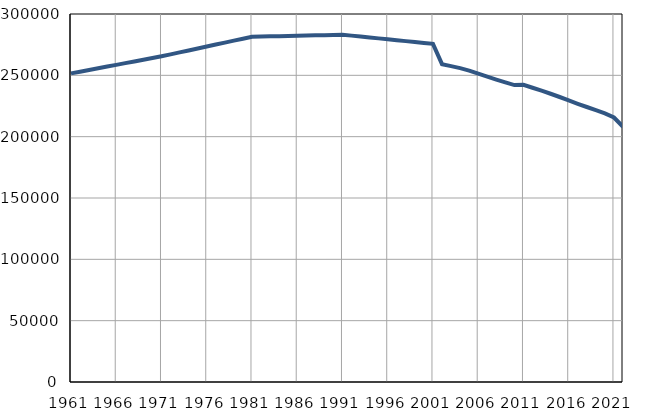
| Category | Број
становника |
|---|---|
| 1961.0 | 251575 |
| 1962.0 | 252970 |
| 1963.0 | 254364 |
| 1964.0 | 255759 |
| 1965.0 | 257153 |
| 1966.0 | 258548 |
| 1967.0 | 259943 |
| 1968.0 | 261337 |
| 1969.0 | 262732 |
| 1970.0 | 264126 |
| 1971.0 | 265521 |
| 1972.0 | 267114 |
| 1973.0 | 268708 |
| 1974.0 | 270301 |
| 1975.0 | 271895 |
| 1976.0 | 273488 |
| 1977.0 | 275081 |
| 1978.0 | 276675 |
| 1979.0 | 278268 |
| 1980.0 | 279860 |
| 1981.0 | 281455 |
| 1982.0 | 281620 |
| 1983.0 | 281786 |
| 1984.0 | 281951 |
| 1985.0 | 282116 |
| 1986.0 | 282282 |
| 1987.0 | 282447 |
| 1988.0 | 282612 |
| 1989.0 | 282777 |
| 1990.0 | 282943 |
| 1991.0 | 283108 |
| 1992.0 | 282363 |
| 1993.0 | 281618 |
| 1994.0 | 280873 |
| 1995.0 | 280128 |
| 1996.0 | 279383 |
| 1997.0 | 278639 |
| 1998.0 | 277894 |
| 1999.0 | 277149 |
| 2000.0 | 276404 |
| 2001.0 | 275659 |
| 2002.0 | 259126 |
| 2003.0 | 257531 |
| 2004.0 | 255879 |
| 2005.0 | 253823 |
| 2006.0 | 251352 |
| 2007.0 | 248895 |
| 2008.0 | 246522 |
| 2009.0 | 244241 |
| 2010.0 | 242040 |
| 2011.0 | 242300 |
| 2012.0 | 239866 |
| 2013.0 | 237492 |
| 2014.0 | 234990 |
| 2015.0 | 232335 |
| 2016.0 | 229554 |
| 2017.0 | 226808 |
| 2018.0 | 224191 |
| 2019.0 | 221672 |
| 2020.0 | 219017 |
| 2021.0 | 215629 |
| 2022.0 | 208087 |